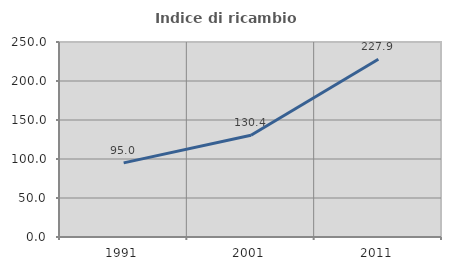
| Category | Indice di ricambio occupazionale  |
|---|---|
| 1991.0 | 95.009 |
| 2001.0 | 130.444 |
| 2011.0 | 227.907 |